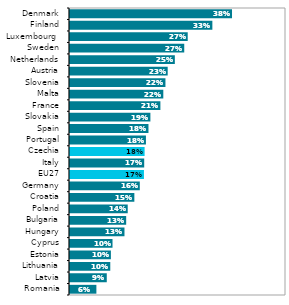
| Category | Series 0 |
|---|---|
| Romania | 0.063 |
| Latvia | 0.087 |
| Lithuania | 0.096 |
| Estonia | 0.097 |
| Cyprus | 0.101 |
| Hungary | 0.128 |
| Bulgaria | 0.132 |
| Poland | 0.136 |
| Croatia | 0.151 |
| Germany | 0.164 |
| EU27 | 0.173 |
| Italy | 0.174 |
| Czechia | 0.175 |
| Portugal | 0.178 |
| Spain | 0.184 |
| Slovakia | 0.188 |
| France | 0.212 |
| Malta | 0.218 |
| Slovenia | 0.223 |
| Austria | 0.228 |
| Netherlands | 0.245 |
| Sweden | 0.267 |
| Luxembourg  | 0.275 |
| Finland | 0.332 |
| Denmark | 0.377 |